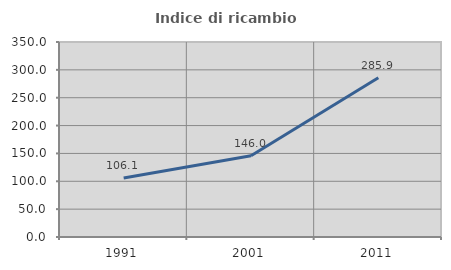
| Category | Indice di ricambio occupazionale  |
|---|---|
| 1991.0 | 106.053 |
| 2001.0 | 145.973 |
| 2011.0 | 285.915 |